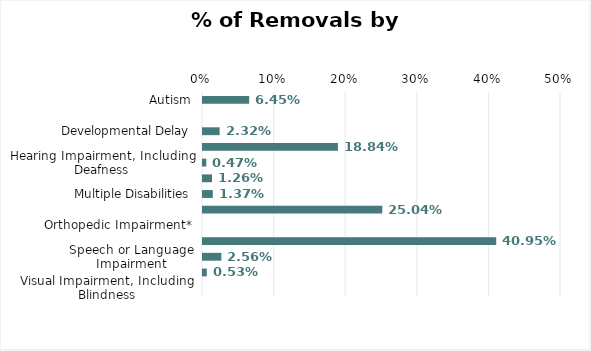
| Category | % of Total Removals |
|---|---|
| Autism | 0.064 |
| Deaf-Blind* | 0 |
| Developmental Delay | 0.023 |
| Serious Emotional Disability | 0.188 |
| Hearing Impairment, Including Deafness | 0.005 |
| Intellectual Disabilities | 0.013 |
| Multiple Disabilities | 0.014 |
| Other Health Impairment | 0.25 |
| Orthopedic Impairment* | 0 |
| Specific Learning Disability | 0.41 |
| Speech or Language Impairment | 0.026 |
| Traumatic Brain Injury | 0.005 |
| Visual Impairment, Including Blindness | 0 |